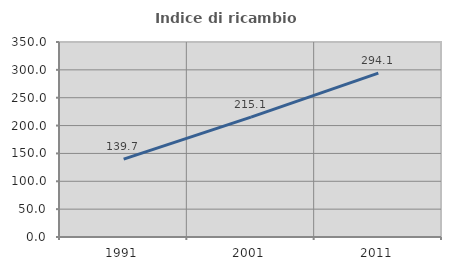
| Category | Indice di ricambio occupazionale  |
|---|---|
| 1991.0 | 139.695 |
| 2001.0 | 215.126 |
| 2011.0 | 294.068 |